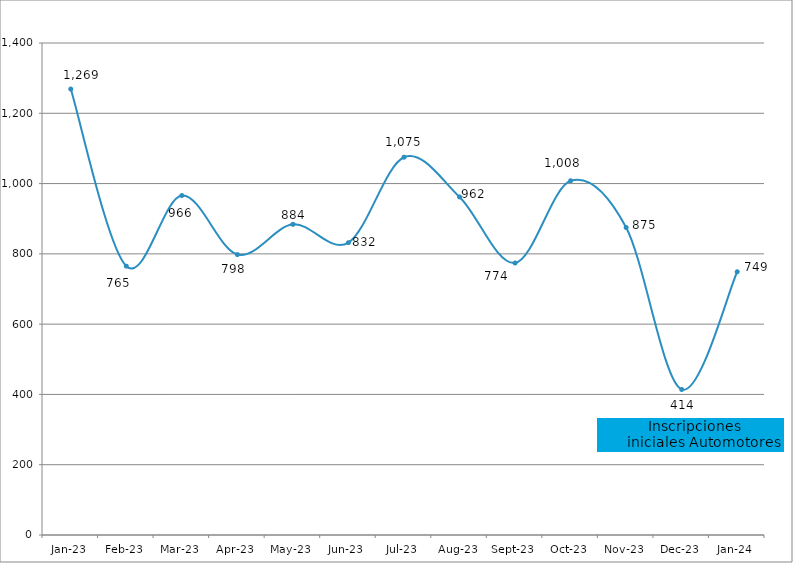
| Category | Inscripciones
iniciales |
|---|---|
| 2023-01-01 | 1269 |
| 2023-02-01 | 765 |
| 2023-03-01 | 966 |
| 2023-04-01 | 798 |
| 2023-05-01 | 884 |
| 2023-06-01 | 832 |
| 2023-07-01 | 1075 |
| 2023-08-01 | 962 |
| 2023-09-01 | 774 |
| 2023-10-01 | 1008 |
| 2023-11-01 | 875 |
| 2023-12-01 | 414 |
| 2024-01-01 | 749 |